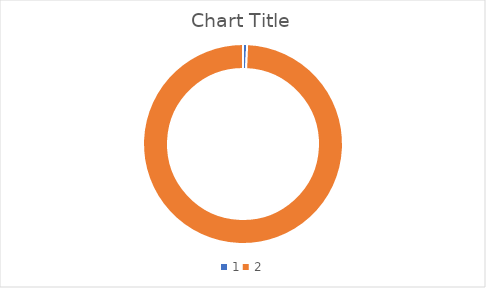
| Category | Series 0 |
|---|---|
| 0 | 17.6 |
| 1 | 2631 |